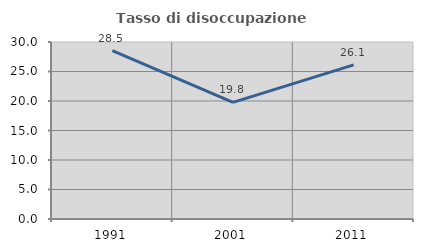
| Category | Tasso di disoccupazione giovanile  |
|---|---|
| 1991.0 | 28.521 |
| 2001.0 | 19.764 |
| 2011.0 | 26.118 |